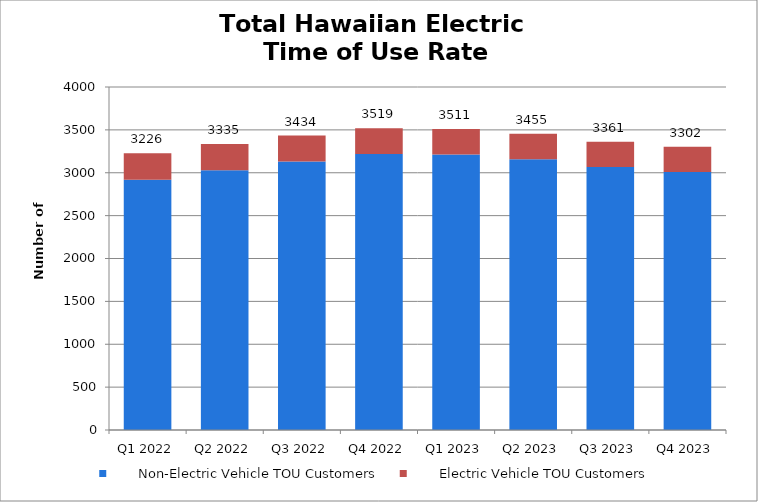
| Category |        Non-Electric Vehicle TOU Customers |        Electric Vehicle TOU Customers |
|---|---|---|
| Q1 2022 | 2917 | 309 |
| Q2 2022 | 3029 | 306 |
| Q3 2022 | 3130 | 304 |
| Q4 2022 | 3219 | 300 |
| Q1 2023 | 3212 | 299 |
| Q2 2023 | 3157 | 298 |
| Q3 2023 | 3066 | 295 |
| Q4 2023 | 3009 | 293 |